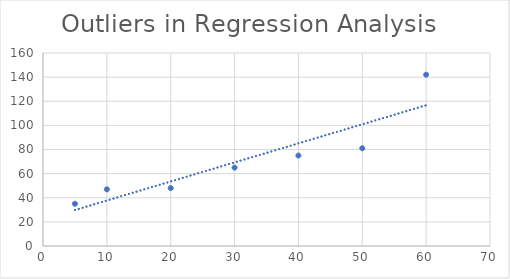
| Category | Casualities |
|---|---|
| 5.0 | 35 |
| 10.0 | 47 |
| 20.0 | 48 |
| 30.0 | 65 |
| 40.0 | 75 |
| 50.0 | 81 |
| 60.0 | 142 |